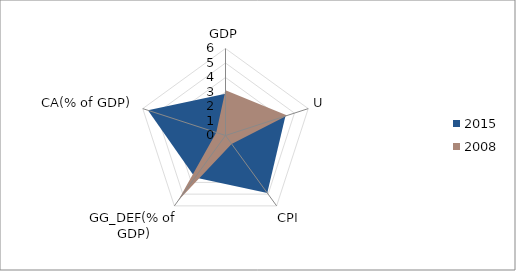
| Category | 2015 | 2008 |
|---|---|---|
| GDP | 2.88 | 3.12 |
| U | 4.348 | 4.478 |
| CPI | 4.9 | 0.714 |
| GG_DEF(% of GDP) | 3.571 | 5.572 |
| CA(% of GDP) | 5.625 | 0.67 |